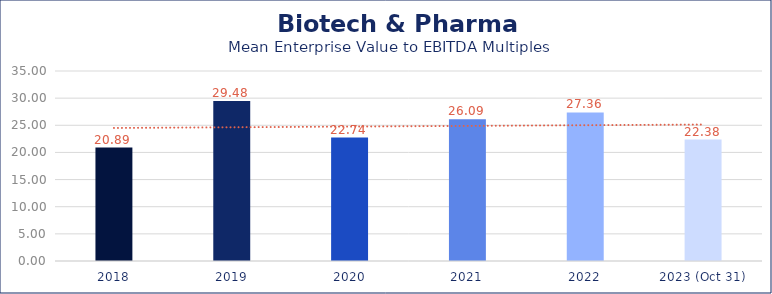
| Category | Biotech & Pharma |
|---|---|
| 2018 | 20.89 |
| 2019 | 29.48 |
| 2020 | 22.74 |
| 2021 | 26.09 |
| 2022 | 27.36 |
| 2023 (Oct 31) | 22.38 |